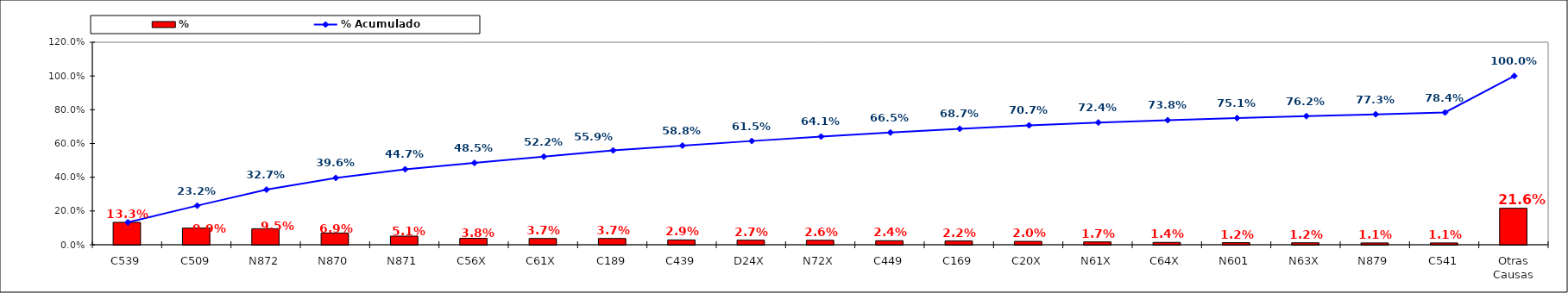
| Category | % |
|---|---|
| C539 | 0.133 |
| C509 | 0.099 |
| N872 | 0.095 |
| N870 | 0.069 |
| N871 | 0.051 |
| C56X | 0.038 |
| C61X | 0.037 |
| C189 | 0.037 |
| C439 | 0.029 |
| D24X | 0.027 |
| N72X | 0.026 |
| C449 | 0.024 |
| C169 | 0.022 |
| C20X | 0.02 |
| N61X | 0.017 |
| C64X | 0.014 |
| N601 | 0.012 |
| N63X | 0.012 |
| N879 | 0.011 |
| C541 | 0.011 |
| Otras Causas | 0.216 |